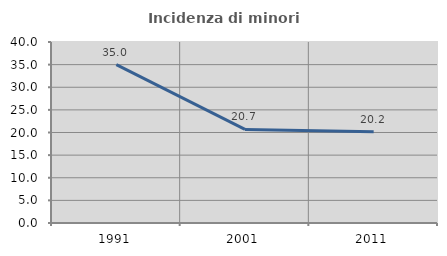
| Category | Incidenza di minori stranieri |
|---|---|
| 1991.0 | 35 |
| 2001.0 | 20.69 |
| 2011.0 | 20.155 |